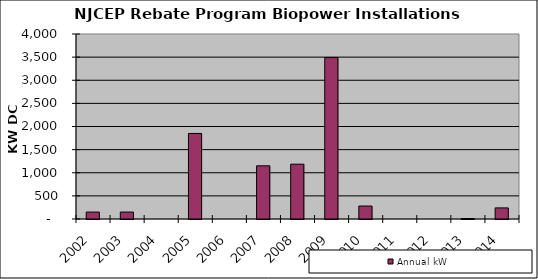
| Category | Annual kW |
|---|---|
| 2002.0 | 150 |
| 2003.0 | 150 |
| 2004.0 | 0 |
| 2005.0 | 1850 |
| 2006.0 | 0 |
| 2007.0 | 1150 |
| 2008.0 | 1185 |
| 2009.0 | 3490 |
| 2010.0 | 280 |
| 2011.0 | 0 |
| 2012.0 | 0 |
| 2013.0 | 10 |
| 2014.0 | 240 |